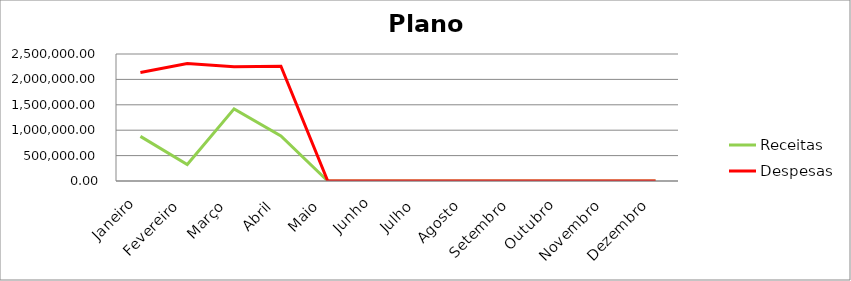
| Category | Receitas | Despesas |
|---|---|---|
| Janeiro | 878788.11 | 2135430.17 |
| Fevereiro | 323392.25 | 2310720.15 |
| Março | 1419584.69 | 2247947.77 |
| Abril | 888991.76 | 2259405.22 |
| Maio | 0 | 0 |
| Junho | 0 | 0 |
| Julho | 0 | 0 |
| Agosto | 0 | 0 |
| Setembro | 0 | 0 |
| Outubro | 0 | 0 |
| Novembro | 0 | 0 |
| Dezembro | 0 | 0 |